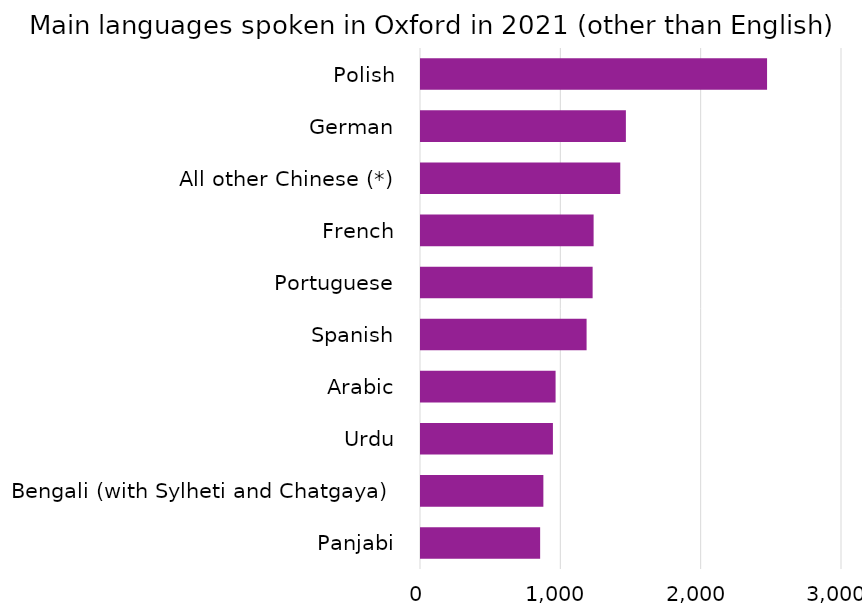
| Category | Series 0 |
|---|---|
| Polish | 2466 |
| German | 1460 |
| All other Chinese (*) | 1420 |
| French | 1230 |
| Portuguese | 1223 |
| Spanish | 1180 |
| Arabic | 959 |
| Urdu | 940 |
| Bengali (with Sylheti and Chatgaya) | 872 |
| Panjabi | 849 |